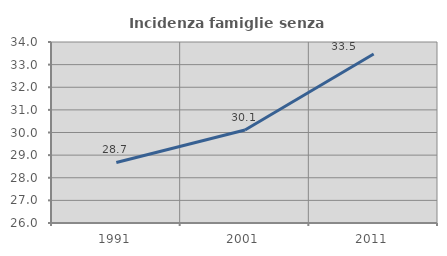
| Category | Incidenza famiglie senza nuclei |
|---|---|
| 1991.0 | 28.675 |
| 2001.0 | 30.111 |
| 2011.0 | 33.471 |